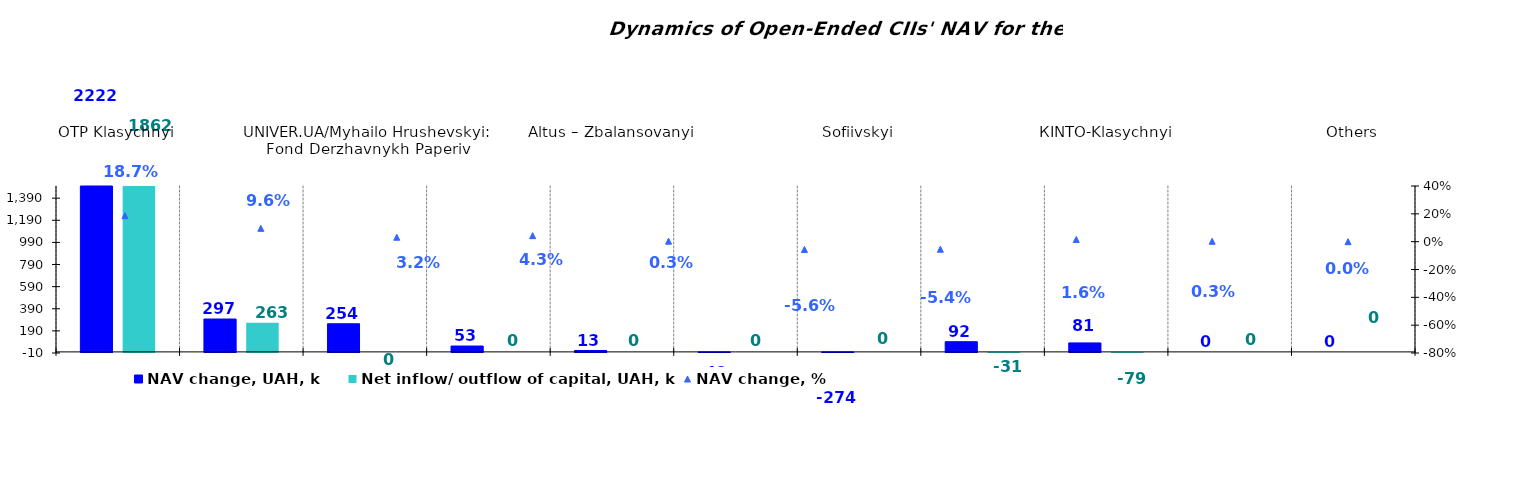
| Category | NAV change, UAH, k | Net inflow/ outflow of capital, UAH, k |
|---|---|---|
| OTP Klasychnyi | 2222.349 | 1861.528 |
| UNIVER.UA/Iaroslav Mudryi: Fond Aktsii | 297.191 | 262.894 |
| UNIVER.UA/Myhailo Hrushevskyi: Fond Derzhavnykh Paperiv | 254.217 | 0 |
| UNIVER.UA/Taras Shevchenko: Fond Zaoshchadzhen | 53.099 | 0 |
| Altus – Zbalansovanyi | 12.551 | 0 |
| Nadbannia | -41.658 | 0 |
| Sofiivskyi | -273.825 | 0 |
| OTP Fond Aktsii | 92.247 | -30.735 |
| КІNТО-Klasychnyi | 81.219 | -79.158 |
| #ПОСИЛАННЯ! | 0 | 0 |
| Others | 0 | 0 |